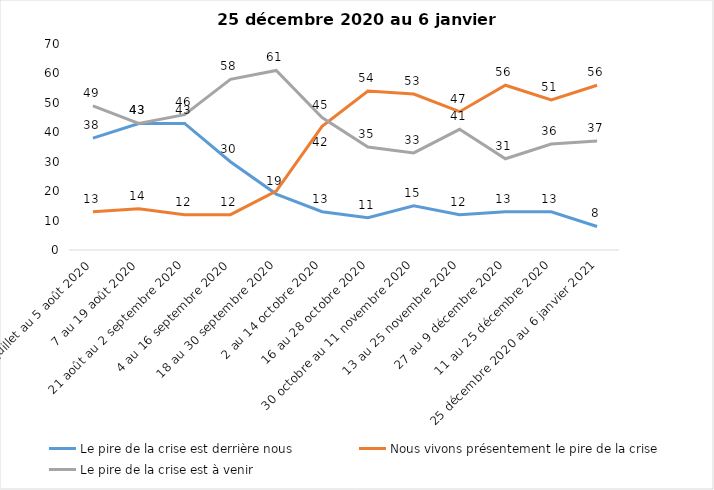
| Category | Le pire de la crise est derrière nous | Nous vivons présentement le pire de la crise | Le pire de la crise est à venir |
|---|---|---|---|
| 24 juillet au 5 août 2020 | 38 | 13 | 49 |
| 7 au 19 août 2020 | 43 | 14 | 43 |
| 21 août au 2 septembre 2020 | 43 | 12 | 46 |
| 4 au 16 septembre 2020 | 30 | 12 | 58 |
| 18 au 30 septembre 2020 | 19 | 20 | 61 |
| 2 au 14 octobre 2020 | 13 | 42 | 45 |
| 16 au 28 octobre 2020 | 11 | 54 | 35 |
| 30 octobre au 11 novembre 2020 | 15 | 53 | 33 |
| 13 au 25 novembre 2020 | 12 | 47 | 41 |
| 27 au 9 décembre 2020 | 13 | 56 | 31 |
| 11 au 25 décembre 2020 | 13 | 51 | 36 |
| 25 décembre 2020 au 6 janvier 2021 | 8 | 56 | 37 |